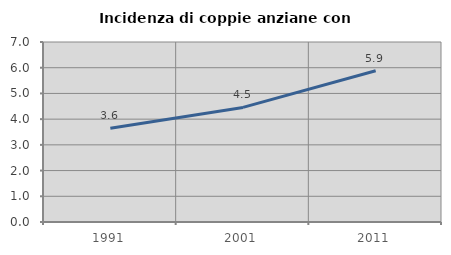
| Category | Incidenza di coppie anziane con figli |
|---|---|
| 1991.0 | 3.644 |
| 2001.0 | 4.456 |
| 2011.0 | 5.882 |